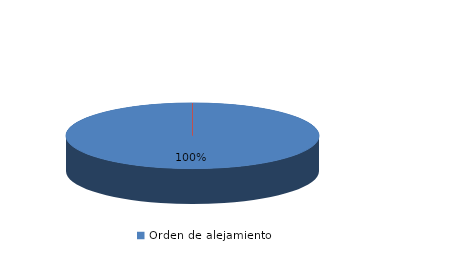
| Category | Series 0 |
|---|---|
| Orden de alejamiento | 34 |
| Orden de protección | 0 |